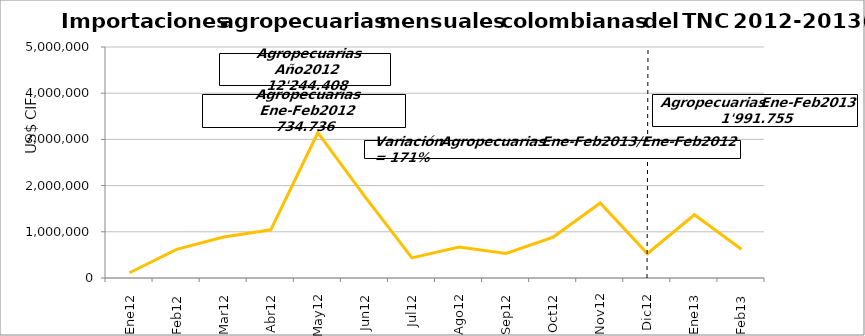
| Category | Agropecuarias |
|---|---|
| 0 | 113244.32 |
| 1 | 621491.75 |
| 2 | 888133.13 |
| 3 | 1042573.96 |
| 4 | 3144320.11 |
| 5 | 1760380.46 |
| 6 | 435238.54 |
| 7 | 670080.8 |
| 8 | 530030.33 |
| 9 | 886327.24 |
| 10 | 1624899.44 |
| 11 | 527687.82 |
| 12 | 1368550.07 |
| 13 | 623204.49 |